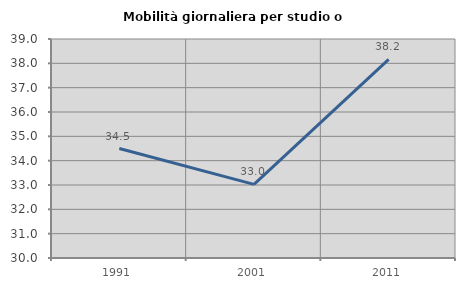
| Category | Mobilità giornaliera per studio o lavoro |
|---|---|
| 1991.0 | 34.499 |
| 2001.0 | 33.028 |
| 2011.0 | 38.166 |